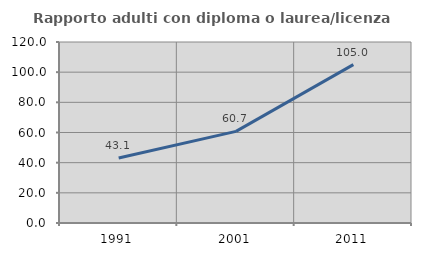
| Category | Rapporto adulti con diploma o laurea/licenza media  |
|---|---|
| 1991.0 | 43.077 |
| 2001.0 | 60.733 |
| 2011.0 | 104.983 |